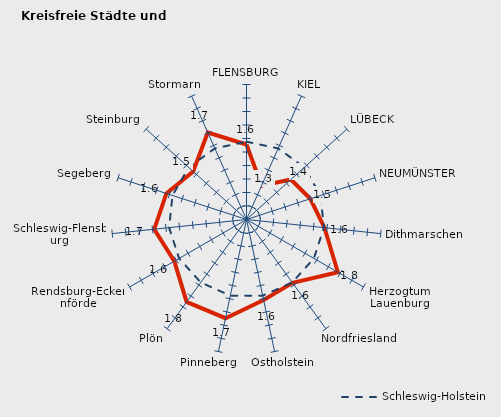
| Category | Kreise | Schleswig-Holstein |
|---|---|---|
| FLENSBURG | 1.556 | 1.576 |
| KIEL | 1.274 | 1.576 |
| LÜBECK | 1.443 | 1.576 |
| NEUMÜNSTER | 1.497 | 1.576 |
| Dithmarschen | 1.58 | 1.576 |
| Herzogtum Lauenburg | 1.782 | 1.576 |
| Nordfriesland | 1.58 | 1.576 |
| Ostholstein | 1.61 | 1.576 |
| Pinneberg | 1.748 | 1.576 |
| Plön | 1.755 | 1.576 |
| Rendsburg-Eckernförde | 1.618 | 1.576 |
| Schleswig-Flensburg | 1.687 | 1.576 |
| Segeberg | 1.624 | 1.576 |
| Steinburg | 1.532 | 1.576 |
| Stormarn | 1.706 | 1.576 |